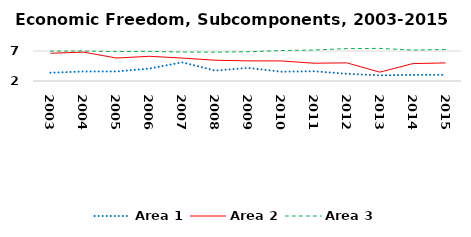
| Category | Area 1 | Area 2 | Area 3 |
|---|---|---|---|
| 2003.0 | 3.375 | 6.623 | 6.991 |
| 2004.0 | 3.59 | 6.813 | 6.996 |
| 2005.0 | 3.589 | 5.83 | 6.893 |
| 2006.0 | 4.07 | 6.117 | 6.942 |
| 2007.0 | 5.113 | 5.816 | 6.823 |
| 2008.0 | 3.736 | 5.464 | 6.803 |
| 2009.0 | 4.188 | 5.353 | 6.874 |
| 2010.0 | 3.552 | 5.348 | 7.075 |
| 2011.0 | 3.626 | 4.962 | 7.163 |
| 2012.0 | 3.202 | 5.025 | 7.399 |
| 2013.0 | 2.942 | 3.473 | 7.435 |
| 2014.0 | 3.022 | 4.901 | 7.161 |
| 2015.0 | 3.029 | 5.018 | 7.252 |